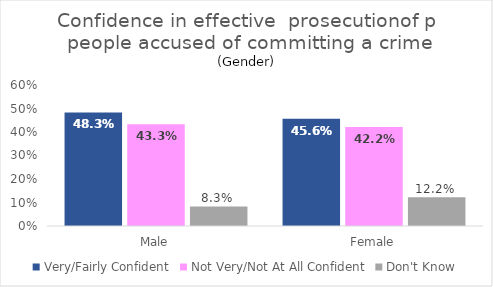
| Category | Very/Fairly Confident | Not Very/Not At All Confident | Don't Know |
|---|---|---|---|
| Male | 0.483 | 0.433 | 0.083 |
| Female | 0.456 | 0.422 | 0.122 |